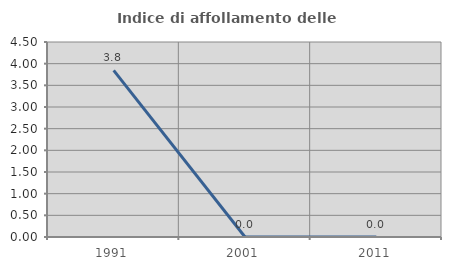
| Category | Indice di affollamento delle abitazioni  |
|---|---|
| 1991.0 | 3.846 |
| 2001.0 | 0 |
| 2011.0 | 0 |